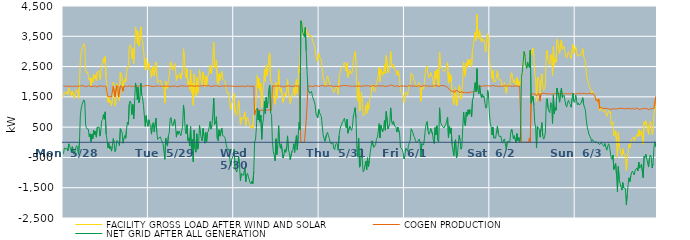
| Category | FACILITY GROSS LOAD AFTER WIND AND SOLAR | COGEN PRODUCTION | NET GRID AFTER ALL GENERATION |
|---|---|---|---|
|  Mon  5/28 | 1485 | 1869 | -384 |
|  Mon  5/28 | 1663 | 1849 | -186 |
|  Mon  5/28 | 1676 | 1845 | -169 |
|  Mon  5/28 | 1597 | 1825 | -228 |
|  Mon  5/28 | 1671 | 1862 | -191 |
|  Mon  5/28 | 1574 | 1858 | -284 |
|  Mon  5/28 | 1793 | 1842 | -49 |
|  Mon  5/28 | 1736 | 1853 | -117 |
|  Mon  5/28 | 1634 | 1851 | -217 |
|  Mon  5/28 | 1535 | 1860 | -325 |
|  Mon  5/28 | 1699 | 1845 | -146 |
|  Mon  5/28 | 1732 | 1857 | -125 |
|  Mon  5/28 | 1456 | 1846 | -390 |
|  Mon  5/28 | 1562 | 1846 | -284 |
|  Mon  5/28 | 1693 | 1857 | -164 |
|  Mon  5/28 | 1750 | 1863 | -113 |
|  Mon  5/28 | 1611 | 1845 | -234 |
|  Mon  5/28 | 1444 | 1842 | -398 |
|  Mon  5/28 | 1854 | 1861 | -7 |
|  Mon  5/28 | 2723 | 1846 | 877 |
|  Mon  5/28 | 2990 | 1861 | 1129 |
|  Mon  5/28 | 3098 | 1855 | 1243 |
|  Mon  5/28 | 3198 | 1868 | 1330 |
|  Mon  5/28 | 3259 | 1858 | 1401 |
|  Mon  5/28 | 3171 | 1847 | 1324 |
|  Mon  5/28 | 2398 | 1845 | 553 |
|  Mon  5/28 | 2292 | 1835 | 457 |
|  Mon  5/28 | 2327 | 1852 | 475 |
|  Mon  5/28 | 2300 | 1869 | 431 |
|  Mon  5/28 | 2042 | 1857 | 185 |
|  Mon  5/28 | 2126 | 1848 | 278 |
|  Mon  5/28 | 1876 | 1855 | 21 |
|  Mon  5/28 | 2106 | 1837 | 269 |
|  Mon  5/28 | 1978 | 1864 | 114 |
|  Mon  5/28 | 2254 | 1851 | 403 |
|  Mon  5/28 | 2113 | 1858 | 255 |
|  Mon  5/28 | 2221 | 1852 | 369 |
|  Mon  5/28 | 2025 | 1856 | 169 |
|  Mon  5/28 | 2320 | 1827 | 493 |
|  Mon  5/28 | 2316 | 1842 | 474 |
|  Mon  5/28 | 2361 | 1856 | 505 |
|  Mon  5/28 | 2075 | 1871 | 204 |
|  Mon  5/28 | 2235 | 1863 | 372 |
|  Mon  5/28 | 2558 | 1848 | 710 |
|  Mon  5/28 | 2605 | 1847 | 758 |
|  Mon  5/28 | 2768 | 1854 | 914 |
|  Mon  5/28 | 2618 | 1856 | 762 |
|  Mon  5/28 | 2838 | 1832 | 1006 |
|  Mon  5/28 | 2113 | 1840 | 273 |
|  Mon  5/28 | 1725 | 1634 | 91 |
|  Mon  5/28 | 1326 | 1517 | -191 |
|  Mon  5/28 | 1504 | 1535 | -31 |
|  Mon  5/28 | 1296 | 1510 | -214 |
|  Mon  5/28 | 1371 | 1506 | -135 |
|  Mon  5/28 | 1200 | 1492 | -292 |
|  Mon  5/28 | 1377 | 1502 | -125 |
|  Mon  5/28 | 1983 | 1861 | 122 |
|  Mon  5/28 | 1857 | 1869 | -12 |
|  Mon  5/28 | 1196 | 1504 | -308 |
|  Mon  5/28 | 1293 | 1509 | -216 |
|  Mon  5/28 | 1934 | 1874 | 60 |
|  Mon  5/28 | 1881 | 1829 | 52 |
|  Mon  5/28 | 1489 | 1500 | -11 |
|  Mon  5/28 | 1374 | 1493 | -119 |
|  Mon  5/28 | 2314 | 1866 | 448 |
|  Mon  5/28 | 2225 | 1855 | 370 |
|  Mon  5/28 | 2164 | 1830 | 334 |
|  Mon  5/28 | 1651 | 1682 | -31 |
|  Mon  5/28 | 1987 | 1854 | 133 |
|  Mon  5/28 | 2092 | 1867 | 225 |
|  Mon  5/28 | 1988 | 1857 | 131 |
|  Mon  5/28 | 2294 | 1849 | 445 |
|  Mon  5/28 | 2509 | 1839 | 670 |
|  Mon  5/28 | 2454 | 1861 | 593 |
|  Mon  5/28 | 3123 | 1866 | 1257 |
|  Mon  5/28 | 3223 | 1862 | 1361 |
|  Mon  5/28 | 3142 | 1850 | 1292 |
|  Mon  5/28 | 2763 | 1851 | 912 |
|  Mon  5/28 | 3090 | 1842 | 1248 |
|  Mon  5/28 | 2604 | 1833 | 771 |
|  Mon  5/28 | 3193 | 1853 | 1340 |
|  Mon  5/28 | 3810 | 1851 | 1959 |
|  Mon  5/28 | 3622 | 1851 | 1771 |
|  Mon  5/28 | 3262 | 1853 | 1409 |
|  Mon  5/28 | 3675 | 1856 | 1819 |
|  Mon  5/28 | 3176 | 1864 | 1312 |
|  Mon  5/28 | 3336 | 1862 | 1474 |
|  Mon  5/28 | 3811 | 1857 | 1954 |
|  Mon  5/28 | 3430 | 1866 | 1564 |
|  Mon  5/28 | 3337 | 1869 | 1468 |
|  Mon  5/28 | 3060 | 1844 | 1216 |
|  Mon  5/28 | 3087 | 1841 | 1246 |
|  Mon  5/28 | 2393 | 1868 | 525 |
|  Mon  5/28 | 2762 | 1882 | 880 |
|  Mon  5/28 | 2524 | 1870 | 654 |
|  Mon  5/28 | 2381 | 1854 | 527 |
|  Tue  5/29 | 2611 | 1869 | 742 |
|  Tue  5/29 | 2478 | 1848 | 630 |
|  Tue  5/29 | 2347 | 1859 | 488 |
|  Tue  5/29 | 2125 | 1856 | 269 |
|  Tue  5/29 | 2431 | 1844 | 587 |
|  Tue  5/29 | 2517 | 1866 | 651 |
|  Tue  5/29 | 2190 | 1843 | 347 |
|  Tue  5/29 | 2170 | 1851 | 319 |
|  Tue  5/29 | 2653 | 1861 | 792 |
|  Tue  5/29 | 2178 | 1846 | 332 |
|  Tue  5/29 | 1955 | 1862 | 93 |
|  Tue  5/29 | 2007 | 1874 | 133 |
|  Tue  5/29 | 2004 | 1850 | 154 |
|  Tue  5/29 | 2053 | 1875 | 178 |
|  Tue  5/29 | 1940 | 1853 | 87 |
|  Tue  5/29 | 1867 | 1851 | 16 |
|  Tue  5/29 | 1808 | 1847 | -39 |
|  Tue  5/29 | 1843 | 1859 | -16 |
|  Tue  5/29 | 1293 | 1855 | -562 |
|  Tue  5/29 | 2011 | 1876 | 135 |
|  Tue  5/29 | 1797 | 1855 | -58 |
|  Tue  5/29 | 1761 | 1887 | -126 |
|  Tue  5/29 | 2071 | 1860 | 211 |
|  Tue  5/29 | 2179 | 1865 | 314 |
|  Tue  5/29 | 2606 | 1831 | 775 |
|  Tue  5/29 | 2665 | 1847 | 818 |
|  Tue  5/29 | 2446 | 1856 | 590 |
|  Tue  5/29 | 2379 | 1844 | 535 |
|  Tue  5/29 | 2362 | 1850 | 512 |
|  Tue  5/29 | 2602 | 1837 | 765 |
|  Tue  5/29 | 2404 | 1860 | 544 |
|  Tue  5/29 | 2028 | 1859 | 169 |
|  Tue  5/29 | 2202 | 1837 | 365 |
|  Tue  5/29 | 2123 | 1858 | 265 |
|  Tue  5/29 | 2227 | 1849 | 378 |
|  Tue  5/29 | 2282 | 1878 | 404 |
|  Tue  5/29 | 2084 | 1866 | 218 |
|  Tue  5/29 | 2109 | 1869 | 240 |
|  Tue  5/29 | 2386 | 1862 | 524 |
|  Tue  5/29 | 3088 | 1856 | 1232 |
|  Tue  5/29 | 2764 | 1863 | 901 |
|  Tue  5/29 | 2248 | 1857 | 391 |
|  Tue  5/29 | 2124 | 1843 | 281 |
|  Tue  5/29 | 2430 | 1846 | 584 |
|  Tue  5/29 | 1919 | 1859 | 60 |
|  Tue  5/29 | 2003 | 1860 | 143 |
|  Tue  5/29 | 1741 | 1861 | -120 |
|  Tue  5/29 | 2387 | 1867 | 520 |
|  Tue  5/29 | 1623 | 1863 | -240 |
|  Tue  5/29 | 1945 | 1843 | 102 |
|  Tue  5/29 | 1221 | 1861 | -640 |
|  Tue  5/29 | 2255 | 1850 | 405 |
|  Tue  5/29 | 1631 | 1843 | -212 |
|  Tue  5/29 | 1518 | 1846 | -328 |
|  Tue  5/29 | 2146 | 1865 | 281 |
|  Tue  5/29 | 1621 | 1849 | -228 |
|  Tue  5/29 | 1788 | 1855 | -67 |
|  Tue  5/29 | 2398 | 1838 | 560 |
|  Tue  5/29 | 2162 | 1863 | 299 |
|  Tue  5/29 | 1989 | 1856 | 133 |
|  Tue  5/29 | 1899 | 1855 | 44 |
|  Tue  5/29 | 2311 | 1854 | 457 |
|  Tue  5/29 | 2090 | 1874 | 216 |
|  Tue  5/29 | 1833 | 1864 | -31 |
|  Tue  5/29 | 2196 | 1868 | 328 |
|  Tue  5/29 | 1876 | 1857 | 19 |
|  Tue  5/29 | 2183 | 1864 | 319 |
|  Tue  5/29 | 2225 | 1857 | 368 |
|  Tue  5/29 | 2386 | 1868 | 518 |
|  Tue  5/29 | 2546 | 1860 | 686 |
|  Tue  5/29 | 2270 | 1835 | 435 |
|  Tue  5/29 | 2406 | 1848 | 558 |
|  Tue  5/29 | 2792 | 1860 | 932 |
|  Tue  5/29 | 3308 | 1849 | 1459 |
|  Tue  5/29 | 2449 | 1861 | 588 |
|  Tue  5/29 | 2511 | 1881 | 630 |
|  Tue  5/29 | 2711 | 1867 | 844 |
|  Tue  5/29 | 1975 | 1851 | 124 |
|  Tue  5/29 | 1909 | 1856 | 53 |
|  Tue  5/29 | 2270 | 1856 | 414 |
|  Tue  5/29 | 2039 | 1838 | 201 |
|  Tue  5/29 | 2047 | 1857 | 190 |
|  Tue  5/29 | 2337 | 1865 | 472 |
|  Tue  5/29 | 2100 | 1871 | 229 |
|  Tue  5/29 | 2094 | 1854 | 240 |
|  Tue  5/29 | 2034 | 1849 | 185 |
|  Tue  5/29 | 1976 | 1855 | 121 |
|  Tue  5/29 | 1766 | 1853 | -87 |
|  Tue  5/29 | 1670 | 1866 | -196 |
|  Tue  5/29 | 1593 | 1850 | -257 |
|  Tue  5/29 | 1637 | 1856 | -219 |
|  Tue  5/29 | 1340 | 1866 | -526 |
|  Tue  5/29 | 1071 | 1857 | -786 |
|  Tue  5/29 | 1264 | 1847 | -583 |
|  Tue  5/29 | 1263 | 1852 | -589 |
|  Tue  5/29 | 1427 | 1853 | -426 |
|  Wed  5/30 | 1616 | 1848 | -232 |
|  Wed  5/30 | 978 | 1847 | -869 |
|  Wed  5/30 | 999 | 1837 | -838 |
|  Wed  5/30 | 879 | 1861 | -982 |
|  Wed  5/30 | 1099 | 1857 | -758 |
|  Wed  5/30 | 1375 | 1849 | -474 |
|  Wed  5/30 | 1098 | 1845 | -747 |
|  Wed  5/30 | 571 | 1843 | -1272 |
|  Wed  5/30 | 819 | 1851 | -1032 |
|  Wed  5/30 | 791 | 1830 | -1039 |
|  Wed  5/30 | 759 | 1854 | -1095 |
|  Wed  5/30 | 873 | 1863 | -990 |
|  Wed  5/30 | 1009 | 1837 | -828 |
|  Wed  5/30 | 556 | 1859 | -1303 |
|  Wed  5/30 | 788 | 1861 | -1073 |
|  Wed  5/30 | 833 | 1857 | -1024 |
|  Wed  5/30 | 721 | 1858 | -1137 |
|  Wed  5/30 | 696 | 1837 | -1141 |
|  Wed  5/30 | 511 | 1849 | -1338 |
|  Wed  5/30 | 469 | 1843 | -1374 |
|  Wed  5/30 | 564 | 1845 | -1281 |
|  Wed  5/30 | 464 | 1832 | -1368 |
|  Wed  5/30 | 893 | 1862 | -969 |
|  Wed  5/30 | 941 | 904 | 37 |
|  Wed  5/30 | 1131 | 1057 | 74 |
|  Wed  5/30 | 1563 | 1075 | 488 |
|  Wed  5/30 | 2208 | 1083 | 1125 |
|  Wed  5/30 | 1796 | 1062 | 734 |
|  Wed  5/30 | 2114 | 1067 | 1047 |
|  Wed  5/30 | 1711 | 1049 | 662 |
|  Wed  5/30 | 1948 | 1054 | 894 |
|  Wed  5/30 | 1148 | 1049 | 99 |
|  Wed  5/30 | 1674 | 1060 | 614 |
|  Wed  5/30 | 1832 | 1051 | 781 |
|  Wed  5/30 | 2400 | 1049 | 1351 |
|  Wed  5/30 | 2001 | 1055 | 946 |
|  Wed  5/30 | 2545 | 1063 | 1482 |
|  Wed  5/30 | 2201 | 1068 | 1133 |
|  Wed  5/30 | 2405 | 1065 | 1340 |
|  Wed  5/30 | 2836 | 1071 | 1765 |
|  Wed  5/30 | 2954 | 1072 | 1882 |
|  Wed  5/30 | 2013 | 1053 | 960 |
|  Wed  5/30 | 1969 | 1053 | 916 |
|  Wed  5/30 | 1884 | 1867 | 17 |
|  Wed  5/30 | 1532 | 1841 | -309 |
|  Wed  5/30 | 1422 | 1850 | -428 |
|  Wed  5/30 | 1253 | 1865 | -612 |
|  Wed  5/30 | 1972 | 1855 | 117 |
|  Wed  5/30 | 1446 | 1852 | -406 |
|  Wed  5/30 | 1755 | 1866 | -111 |
|  Wed  5/30 | 2406 | 1858 | 548 |
|  Wed  5/30 | 1799 | 1860 | -61 |
|  Wed  5/30 | 1659 | 1856 | -197 |
|  Wed  5/30 | 1799 | 1849 | -50 |
|  Wed  5/30 | 1782 | 1856 | -74 |
|  Wed  5/30 | 1310 | 1830 | -520 |
|  Wed  5/30 | 1431 | 1838 | -407 |
|  Wed  5/30 | 1609 | 1849 | -240 |
|  Wed  5/30 | 1527 | 1855 | -328 |
|  Wed  5/30 | 1700 | 1853 | -153 |
|  Wed  5/30 | 2078 | 1866 | 212 |
|  Wed  5/30 | 1620 | 1864 | -244 |
|  Wed  5/30 | 1497 | 1846 | -349 |
|  Wed  5/30 | 1280 | 1857 | -577 |
|  Wed  5/30 | 1252 | 1855 | -603 |
|  Wed  5/30 | 1558 | 1845 | -287 |
|  Wed  5/30 | 1611 | 1858 | -247 |
|  Wed  5/30 | 1799 | 1848 | -49 |
|  Wed  5/30 | 1524 | 1857 | -333 |
|  Wed  5/30 | 1897 | 1866 | 31 |
|  Wed  5/30 | 2072 | 1847 | 225 |
|  Wed  5/30 | 1598 | 1855 | -257 |
|  Wed  5/30 | 2081 | 1858 | 223 |
|  Wed  5/30 | 2520 | 1861 | 659 |
|  Wed  5/30 | 2288 | 1870 | 418 |
|  Wed  5/30 | 4013 | 0 | 4013 |
|  Wed  5/30 | 3922 | 0 | 3922 |
|  Wed  5/30 | 3631 | 0 | 3631 |
|  Wed  5/30 | 3610 | 0 | 3610 |
|  Wed  5/30 | 3474 | 0 | 3474 |
|  Wed  5/30 | 3792 | 0 | 3792 |
|  Wed  5/30 | 3736 | 712 | 3024 |
|  Wed  5/30 | 3548 | 1235 | 2313 |
|  Wed  5/30 | 3604 | 1872 | 1732 |
|  Wed  5/30 | 3620 | 1867 | 1753 |
|  Wed  5/30 | 3473 | 1852 | 1621 |
|  Wed  5/30 | 3479 | 1866 | 1613 |
|  Wed  5/30 | 3531 | 1849 | 1682 |
|  Wed  5/30 | 3374 | 1854 | 1520 |
|  Wed  5/30 | 3347 | 1842 | 1505 |
|  Wed  5/30 | 3194 | 1841 | 1353 |
|  Wed  5/30 | 3108 | 1870 | 1238 |
|  Wed  5/30 | 2807 | 1870 | 937 |
|  Wed  5/30 | 2804 | 1860 | 944 |
|  Wed  5/30 | 2657 | 1856 | 801 |
|  Wed  5/30 | 2936 | 1844 | 1092 |
|  Thu  5/31 | 2832 | 1860 | 972 |
|  Thu  5/31 | 2834 | 1866 | 968 |
|  Thu  5/31 | 2712 | 1858 | 854 |
|  Thu  5/31 | 2742 | 1874 | 868 |
|  Thu  5/31 | 2122 | 1875 | 247 |
|  Thu  5/31 | 2132 | 1856 | 276 |
|  Thu  5/31 | 1904 | 1872 | 32 |
|  Thu  5/31 | 1863 | 1851 | 12 |
|  Thu  5/31 | 2111 | 1849 | 262 |
|  Thu  5/31 | 2195 | 1868 | 327 |
|  Thu  5/31 | 2088 | 1867 | 221 |
|  Thu  5/31 | 1994 | 1869 | 125 |
|  Thu  5/31 | 1846 | 1847 | -1 |
|  Thu  5/31 | 1815 | 1865 | -50 |
|  Thu  5/31 | 1803 | 1839 | -36 |
|  Thu  5/31 | 1812 | 1839 | -27 |
|  Thu  5/31 | 1645 | 1853 | -208 |
|  Thu  5/31 | 1612 | 1854 | -242 |
|  Thu  5/31 | 1757 | 1847 | -90 |
|  Thu  5/31 | 1830 | 1858 | -28 |
|  Thu  5/31 | 1784 | 1855 | -71 |
|  Thu  5/31 | 1574 | 1837 | -263 |
|  Thu  5/31 | 2076 | 1858 | 218 |
|  Thu  5/31 | 2286 | 1860 | 426 |
|  Thu  5/31 | 2394 | 1860 | 534 |
|  Thu  5/31 | 2462 | 1860 | 602 |
|  Thu  5/31 | 2532 | 1852 | 680 |
|  Thu  5/31 | 2568 | 1878 | 690 |
|  Thu  5/31 | 2648 | 1856 | 792 |
|  Thu  5/31 | 2483 | 1871 | 612 |
|  Thu  5/31 | 2350 | 1866 | 484 |
|  Thu  5/31 | 2623 | 1864 | 759 |
|  Thu  5/31 | 2147 | 1848 | 299 |
|  Thu  5/31 | 2139 | 1863 | 276 |
|  Thu  5/31 | 2391 | 1855 | 536 |
|  Thu  5/31 | 2365 | 1854 | 511 |
|  Thu  5/31 | 2252 | 1860 | 392 |
|  Thu  5/31 | 2357 | 1849 | 508 |
|  Thu  5/31 | 2702 | 1834 | 868 |
|  Thu  5/31 | 2840 | 1852 | 988 |
|  Thu  5/31 | 2993 | 1851 | 1142 |
|  Thu  5/31 | 2671 | 1856 | 815 |
|  Thu  5/31 | 1637 | 1831 | -194 |
|  Thu  5/31 | 1365 | 1856 | -491 |
|  Thu  5/31 | 1992 | 1862 | 130 |
|  Thu  5/31 | 1028 | 1851 | -823 |
|  Thu  5/31 | 1100 | 1856 | -756 |
|  Thu  5/31 | 1651 | 1854 | -203 |
|  Thu  5/31 | 1327 | 1856 | -529 |
|  Thu  5/31 | 879 | 1854 | -975 |
|  Thu  5/31 | 904 | 1843 | -939 |
|  Thu  5/31 | 920 | 1866 | -946 |
|  Thu  5/31 | 1221 | 1840 | -619 |
|  Thu  5/31 | 951 | 1864 | -913 |
|  Thu  5/31 | 1324 | 1833 | -509 |
|  Thu  5/31 | 1063 | 1871 | -808 |
|  Thu  5/31 | 1267 | 1872 | -605 |
|  Thu  5/31 | 1510 | 1845 | -335 |
|  Thu  5/31 | 1550 | 1852 | -302 |
|  Thu  5/31 | 1917 | 1866 | 51 |
|  Thu  5/31 | 1914 | 1866 | 48 |
|  Thu  5/31 | 1705 | 1870 | -165 |
|  Thu  5/31 | 1668 | 1856 | -188 |
|  Thu  5/31 | 1763 | 1846 | -83 |
|  Thu  5/31 | 1938 | 1844 | 94 |
|  Thu  5/31 | 2024 | 1862 | 162 |
|  Thu  5/31 | 2198 | 1857 | 341 |
|  Thu  5/31 | 2480 | 1862 | 618 |
|  Thu  5/31 | 2003 | 1858 | 145 |
|  Thu  5/31 | 2428 | 1862 | 566 |
|  Thu  5/31 | 2444 | 1882 | 562 |
|  Thu  5/31 | 2210 | 1870 | 340 |
|  Thu  5/31 | 2292 | 1846 | 446 |
|  Thu  5/31 | 2563 | 1845 | 718 |
|  Thu  5/31 | 2266 | 1869 | 397 |
|  Thu  5/31 | 2868 | 1851 | 1017 |
|  Thu  5/31 | 2863 | 1867 | 996 |
|  Thu  5/31 | 2293 | 1855 | 438 |
|  Thu  5/31 | 2386 | 1864 | 522 |
|  Thu  5/31 | 2519 | 1878 | 641 |
|  Thu  5/31 | 3013 | 1875 | 1138 |
|  Thu  5/31 | 2583 | 1887 | 696 |
|  Thu  5/31 | 2457 | 1863 | 594 |
|  Thu  5/31 | 2565 | 1860 | 705 |
|  Thu  5/31 | 2443 | 1874 | 569 |
|  Thu  5/31 | 2388 | 1840 | 548 |
|  Thu  5/31 | 2345 | 1861 | 484 |
|  Thu  5/31 | 2217 | 1877 | 340 |
|  Thu  5/31 | 2374 | 1869 | 505 |
|  Thu  5/31 | 2343 | 1833 | 510 |
|  Thu  5/31 | 2155 | 1865 | 290 |
|  Thu  5/31 | 1697 | 1863 | -166 |
|  Thu  5/31 | 1678 | 1851 | -173 |
|  Thu  5/31 | 1613 | 1850 | -237 |
|  Thu  5/31 | 1532 | 1871 | -339 |
|  Thu  5/31 | 1307 | 1859 | -552 |
|  Fri  6/1 | 1409 | 1846 | -437 |
|  Fri  6/1 | 1656 | 1851 | -195 |
|  Fri  6/1 | 1680 | 1852 | -172 |
|  Fri  6/1 | 1544 | 1842 | -298 |
|  Fri  6/1 | 1772 | 1878 | -106 |
|  Fri  6/1 | 1746 | 1847 | -101 |
|  Fri  6/1 | 1929 | 1858 | 71 |
|  Fri  6/1 | 2279 | 1833 | 446 |
|  Fri  6/1 | 2235 | 1854 | 381 |
|  Fri  6/1 | 2183 | 1870 | 313 |
|  Fri  6/1 | 2057 | 1856 | 201 |
|  Fri  6/1 | 2011 | 1864 | 147 |
|  Fri  6/1 | 1904 | 1856 | 48 |
|  Fri  6/1 | 1834 | 1844 | -10 |
|  Fri  6/1 | 1849 | 1847 | 2 |
|  Fri  6/1 | 1900 | 1856 | 44 |
|  Fri  6/1 | 1974 | 1868 | 106 |
|  Fri  6/1 | 1863 | 1854 | 9 |
|  Fri  6/1 | 1352 | 1831 | -479 |
|  Fri  6/1 | 1816 | 1863 | -47 |
|  Fri  6/1 | 1818 | 1870 | -52 |
|  Fri  6/1 | 1759 | 1848 | -89 |
|  Fri  6/1 | 1994 | 1868 | 126 |
|  Fri  6/1 | 2306 | 1865 | 441 |
|  Fri  6/1 | 2471 | 1863 | 608 |
|  Fri  6/1 | 2524 | 1840 | 684 |
|  Fri  6/1 | 2248 | 1854 | 394 |
|  Fri  6/1 | 2128 | 1866 | 262 |
|  Fri  6/1 | 2175 | 1853 | 322 |
|  Fri  6/1 | 2305 | 1847 | 458 |
|  Fri  6/1 | 2292 | 1861 | 431 |
|  Fri  6/1 | 2125 | 1850 | 275 |
|  Fri  6/1 | 1922 | 1858 | 64 |
|  Fri  6/1 | 1801 | 1843 | -42 |
|  Fri  6/1 | 2351 | 1865 | 486 |
|  Fri  6/1 | 2099 | 1850 | 249 |
|  Fri  6/1 | 2416 | 1869 | 547 |
|  Fri  6/1 | 1926 | 1863 | 63 |
|  Fri  6/1 | 1858 | 1844 | 14 |
|  Fri  6/1 | 2972 | 1835 | 1137 |
|  Fri  6/1 | 2521 | 1867 | 654 |
|  Fri  6/1 | 2464 | 1859 | 605 |
|  Fri  6/1 | 2407 | 1874 | 533 |
|  Fri  6/1 | 2428 | 1869 | 559 |
|  Fri  6/1 | 2338 | 1864 | 474 |
|  Fri  6/1 | 2354 | 1856 | 498 |
|  Fri  6/1 | 2448 | 1850 | 598 |
|  Fri  6/1 | 2523 | 1825 | 698 |
|  Fri  6/1 | 2639 | 1811 | 828 |
|  Fri  6/1 | 1935 | 1789 | 146 |
|  Fri  6/1 | 2295 | 1756 | 539 |
|  Fri  6/1 | 2011 | 1716 | 295 |
|  Fri  6/1 | 2213 | 1738 | 475 |
|  Fri  6/1 | 1600 | 1678 | -78 |
|  Fri  6/1 | 1582 | 1683 | -101 |
|  Fri  6/1 | 1243 | 1689 | -446 |
|  Fri  6/1 | 1647 | 1641 | 6 |
|  Fri  6/1 | 1803 | 1718 | 85 |
|  Fri  6/1 | 1204 | 1721 | -517 |
|  Fri  6/1 | 1276 | 1701 | -425 |
|  Fri  6/1 | 1271 | 1671 | -400 |
|  Fri  6/1 | 1884 | 1656 | 228 |
|  Fri  6/1 | 1740 | 1658 | 82 |
|  Fri  6/1 | 1415 | 1643 | -228 |
|  Fri  6/1 | 1525 | 1684 | -159 |
|  Fri  6/1 | 2083 | 1638 | 445 |
|  Fri  6/1 | 2637 | 1638 | 999 |
|  Fri  6/1 | 2273 | 1651 | 622 |
|  Fri  6/1 | 2165 | 1626 | 539 |
|  Fri  6/1 | 2623 | 1627 | 996 |
|  Fri  6/1 | 2496 | 1634 | 862 |
|  Fri  6/1 | 2733 | 1661 | 1072 |
|  Fri  6/1 | 2550 | 1624 | 926 |
|  Fri  6/1 | 2729 | 1650 | 1079 |
|  Fri  6/1 | 2679 | 1662 | 1017 |
|  Fri  6/1 | 2480 | 1642 | 838 |
|  Fri  6/1 | 3044 | 1656 | 1388 |
|  Fri  6/1 | 3140 | 1643 | 1497 |
|  Fri  6/1 | 3438 | 1686 | 1752 |
|  Fri  6/1 | 3633 | 1661 | 1972 |
|  Fri  6/1 | 3361 | 1693 | 1668 |
|  Fri  6/1 | 4223 | 1790 | 2433 |
|  Fri  6/1 | 3573 | 1839 | 1734 |
|  Fri  6/1 | 3420 | 1824 | 1596 |
|  Fri  6/1 | 3689 | 1813 | 1876 |
|  Fri  6/1 | 3456 | 1860 | 1596 |
|  Fri  6/1 | 3310 | 1829 | 1481 |
|  Fri  6/1 | 3447 | 1852 | 1595 |
|  Fri  6/1 | 3338 | 1859 | 1479 |
|  Fri  6/1 | 3388 | 1863 | 1525 |
|  Fri  6/1 | 3144 | 1855 | 1289 |
|  Fri  6/1 | 2987 | 1861 | 1126 |
|  Fri  6/1 | 3009 | 1844 | 1165 |
|  Fri  6/1 | 3593 | 1867 | 1726 |
|  Fri  6/1 | 3417 | 1850 | 1567 |
|  Fri  6/1 | 2815 | 1858 | 957 |
|  Sat  6/2 | 2500 | 1876 | 624 |
|  Sat  6/2 | 2372 | 1852 | 520 |
|  Sat  6/2 | 2097 | 1858 | 239 |
|  Sat  6/2 | 2383 | 1886 | 497 |
|  Sat  6/2 | 1996 | 1857 | 139 |
|  Sat  6/2 | 1991 | 1852 | 139 |
|  Sat  6/2 | 2010 | 1868 | 142 |
|  Sat  6/2 | 2028 | 1859 | 169 |
|  Sat  6/2 | 2367 | 1836 | 531 |
|  Sat  6/2 | 2132 | 1842 | 290 |
|  Sat  6/2 | 2059 | 1866 | 193 |
|  Sat  6/2 | 2057 | 1850 | 207 |
|  Sat  6/2 | 2068 | 1870 | 198 |
|  Sat  6/2 | 1861 | 1854 | 7 |
|  Sat  6/2 | 1837 | 1865 | -28 |
|  Sat  6/2 | 1932 | 1856 | 76 |
|  Sat  6/2 | 1977 | 1864 | 113 |
|  Sat  6/2 | 1971 | 1871 | 100 |
|  Sat  6/2 | 1607 | 1845 | -238 |
|  Sat  6/2 | 1838 | 1847 | -9 |
|  Sat  6/2 | 1912 | 1869 | 43 |
|  Sat  6/2 | 1912 | 1868 | 44 |
|  Sat  6/2 | 1852 | 1858 | -6 |
|  Sat  6/2 | 2190 | 1852 | 338 |
|  Sat  6/2 | 2298 | 1860 | 438 |
|  Sat  6/2 | 2146 | 1849 | 297 |
|  Sat  6/2 | 1965 | 1854 | 111 |
|  Sat  6/2 | 2073 | 1856 | 217 |
|  Sat  6/2 | 2091 | 1854 | 237 |
|  Sat  6/2 | 1851 | 1867 | -16 |
|  Sat  6/2 | 2141 | 1854 | 287 |
|  Sat  6/2 | 1897 | 1844 | 53 |
|  Sat  6/2 | 2025 | 1873 | 152 |
|  Sat  6/2 | 1844 | 1854 | -10 |
|  Sat  6/2 | 2067 | 1860 | 207 |
|  Sat  6/2 | 2138 | 0 | 2138 |
|  Sat  6/2 | 2311 | 0 | 2311 |
|  Sat  6/2 | 2309 | 0 | 2309 |
|  Sat  6/2 | 2998 | 0 | 2998 |
|  Sat  6/2 | 2860 | 0 | 2860 |
|  Sat  6/2 | 2543 | 0 | 2543 |
|  Sat  6/2 | 2444 | 0 | 2444 |
|  Sat  6/2 | 2643 | 0 | 2643 |
|  Sat  6/2 | 2530 | 0 | 2530 |
|  Sat  6/2 | 2614 | 143 | 2471 |
|  Sat  6/2 | 3039 | 0 | 3039 |
|  Sat  6/2 | 2894 | 1602 | 1292 |
|  Sat  6/2 | 2906 | 1589 | 1317 |
|  Sat  6/2 | 3113 | 1591 | 1522 |
|  Sat  6/2 | 2846 | 1610 | 1236 |
|  Sat  6/2 | 2259 | 1605 | 654 |
|  Sat  6/2 | 2116 | 1606 | 510 |
|  Sat  6/2 | 1335 | 1526 | -191 |
|  Sat  6/2 | 2123 | 1595 | 528 |
|  Sat  6/2 | 2158 | 1601 | 557 |
|  Sat  6/2 | 2034 | 1603 | 431 |
|  Sat  6/2 | 1526 | 1359 | 167 |
|  Sat  6/2 | 2049 | 1603 | 446 |
|  Sat  6/2 | 2259 | 1607 | 652 |
|  Sat  6/2 | 1829 | 1616 | 213 |
|  Sat  6/2 | 1713 | 1610 | 103 |
|  Sat  6/2 | 1770 | 1616 | 154 |
|  Sat  6/2 | 1923 | 1588 | 335 |
|  Sat  6/2 | 2943 | 1595 | 1348 |
|  Sat  6/2 | 3034 | 1592 | 1442 |
|  Sat  6/2 | 2737 | 1604 | 1133 |
|  Sat  6/2 | 2621 | 1594 | 1027 |
|  Sat  6/2 | 2570 | 1591 | 979 |
|  Sat  6/2 | 2900 | 1588 | 1312 |
|  Sat  6/2 | 2843 | 1590 | 1253 |
|  Sat  6/2 | 2206 | 1585 | 621 |
|  Sat  6/2 | 3167 | 1601 | 1566 |
|  Sat  6/2 | 2519 | 1583 | 936 |
|  Sat  6/2 | 2757 | 1610 | 1147 |
|  Sat  6/2 | 2651 | 1593 | 1058 |
|  Sat  6/2 | 3400 | 1614 | 1786 |
|  Sat  6/2 | 3357 | 1598 | 1759 |
|  Sat  6/2 | 3104 | 1598 | 1506 |
|  Sat  6/2 | 2932 | 1610 | 1322 |
|  Sat  6/2 | 3256 | 1603 | 1653 |
|  Sat  6/2 | 3379 | 1585 | 1794 |
|  Sat  6/2 | 3066 | 1594 | 1472 |
|  Sat  6/2 | 3108 | 1596 | 1512 |
|  Sat  6/2 | 3162 | 1605 | 1557 |
|  Sat  6/2 | 3131 | 1606 | 1525 |
|  Sat  6/2 | 2816 | 1598 | 1218 |
|  Sat  6/2 | 2778 | 1615 | 1163 |
|  Sat  6/2 | 2926 | 1606 | 1320 |
|  Sat  6/2 | 2990 | 1606 | 1384 |
|  Sat  6/2 | 2888 | 1599 | 1289 |
|  Sat  6/2 | 2849 | 1600 | 1249 |
|  Sat  6/2 | 2768 | 1610 | 1158 |
|  Sat  6/2 | 3036 | 1591 | 1445 |
|  Sat  6/2 | 3232 | 1616 | 1616 |
|  Sat  6/2 | 2936 | 1582 | 1354 |
|  Sat  6/2 | 2924 | 1610 | 1314 |
|  Sun  6/3 | 3163 | 1602 | 1561 |
|  Sun  6/3 | 2996 | 1613 | 1383 |
|  Sun  6/3 | 2843 | 1608 | 1235 |
|  Sun  6/3 | 2894 | 1596 | 1298 |
|  Sun  6/3 | 2853 | 1620 | 1233 |
|  Sun  6/3 | 2868 | 1612 | 1256 |
|  Sun  6/3 | 2878 | 1594 | 1284 |
|  Sun  6/3 | 2861 | 1604 | 1257 |
|  Sun  6/3 | 3093 | 1620 | 1473 |
|  Sun  6/3 | 2836 | 1590 | 1246 |
|  Sun  6/3 | 2770 | 1612 | 1158 |
|  Sun  6/3 | 2662 | 1611 | 1051 |
|  Sun  6/3 | 2335 | 1598 | 737 |
|  Sun  6/3 | 2096 | 1586 | 510 |
|  Sun  6/3 | 1991 | 1601 | 390 |
|  Sun  6/3 | 1868 | 1608 | 260 |
|  Sun  6/3 | 1849 | 1622 | 227 |
|  Sun  6/3 | 1732 | 1595 | 137 |
|  Sun  6/3 | 1611 | 1593 | 18 |
|  Sun  6/3 | 1686 | 1599 | 87 |
|  Sun  6/3 | 1657 | 1606 | 51 |
|  Sun  6/3 | 1573 | 1564 | 9 |
|  Sun  6/3 | 1493 | 1495 | -2 |
|  Sun  6/3 | 1392 | 1380 | 12 |
|  Sun  6/3 | 1441 | 1426 | 15 |
|  Sun  6/3 | 1320 | 1339 | -19 |
|  Sun  6/3 | 1433 | 1431 | 2 |
|  Sun  6/3 | 1044 | 1120 | -76 |
|  Sun  6/3 | 1051 | 1113 | -62 |
|  Sun  6/3 | 1179 | 1168 | 11 |
|  Sun  6/3 | 1049 | 1118 | -69 |
|  Sun  6/3 | 1010 | 1098 | -88 |
|  Sun  6/3 | 983 | 1116 | -133 |
|  Sun  6/3 | 1068 | 1103 | -35 |
|  Sun  6/3 | 962 | 1120 | -158 |
|  Sun  6/3 | 853 | 1115 | -262 |
|  Sun  6/3 | 873 | 1117 | -244 |
|  Sun  6/3 | 1060 | 1109 | -49 |
|  Sun  6/3 | 961 | 1090 | -129 |
|  Sun  6/3 | 1003 | 1114 | -111 |
|  Sun  6/3 | 570 | 1092 | -522 |
|  Sun  6/3 | 543 | 1108 | -565 |
|  Sun  6/3 | 680 | 1101 | -421 |
|  Sun  6/3 | 218 | 1116 | -898 |
|  Sun  6/3 | 335 | 1112 | -777 |
|  Sun  6/3 | 400 | 1098 | -698 |
|  Sun  6/3 | 9 | 1084 | -1075 |
|  Sun  6/3 | -513 | 1118 | -1631 |
|  Sun  6/3 | 318 | 1115 | -797 |
|  Sun  6/3 | -118 | 1116 | -1234 |
|  Sun  6/3 | -227 | 1122 | -1349 |
|  Sun  6/3 | -365 | 1124 | -1489 |
|  Sun  6/3 | -463 | 1116 | -1579 |
|  Sun  6/3 | -210 | 1119 | -1329 |
|  Sun  6/3 | -381 | 1120 | -1501 |
|  Sun  6/3 | -394 | 1101 | -1495 |
|  Sun  6/3 | -419 | 1109 | -1528 |
|  Sun  6/3 | -946 | 1121 | -2067 |
|  Sun  6/3 | -606 | 1121 | -1727 |
|  Sun  6/3 | -290 | 1111 | -1401 |
|  Sun  6/3 | -76 | 1095 | -1171 |
|  Sun  6/3 | -184 | 1112 | -1296 |
|  Sun  6/3 | -2 | 1114 | -1116 |
|  Sun  6/3 | 107 | 1099 | -992 |
|  Sun  6/3 | 137 | 1089 | -952 |
|  Sun  6/3 | 173 | 1123 | -950 |
|  Sun  6/3 | 34 | 1114 | -1080 |
|  Sun  6/3 | 168 | 1083 | -915 |
|  Sun  6/3 | 209 | 1126 | -917 |
|  Sun  6/3 | 255 | 1105 | -850 |
|  Sun  6/3 | 174 | 1122 | -948 |
|  Sun  6/3 | 424 | 1080 | -656 |
|  Sun  6/3 | 227 | 1082 | -855 |
|  Sun  6/3 | 306 | 1099 | -793 |
|  Sun  6/3 | 390 | 1111 | -721 |
|  Sun  6/3 | 389 | 1101 | -712 |
|  Sun  6/3 | -63 | 1105 | -1168 |
|  Sun  6/3 | 673 | 1130 | -457 |
|  Sun  6/3 | 587 | 1097 | -510 |
|  Sun  6/3 | 711 | 1107 | -396 |
|  Sun  6/3 | 551 | 1095 | -544 |
|  Sun  6/3 | 542 | 1111 | -569 |
|  Sun  6/3 | 254 | 1072 | -818 |
|  Sun  6/3 | 584 | 1105 | -521 |
|  Sun  6/3 | 690 | 1108 | -418 |
|  Sun  6/3 | 605 | 1091 | -486 |
|  Sun  6/3 | 254 | 1105 | -851 |
|  Sun  6/3 | 381 | 1100 | -719 |
|  Sun  6/3 | 903 | 1114 | -211 |
|  Sun  6/3 | 1124 | 1110 | 14 |
|  Sun  6/3 | 1368 | 1505 | -137 |
|  Sun  6/3 | 1076 | 1116 | -40 |